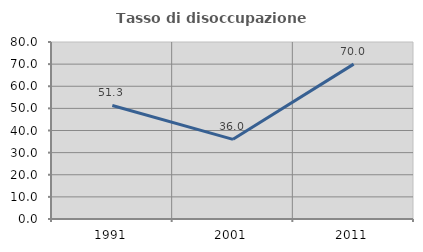
| Category | Tasso di disoccupazione giovanile  |
|---|---|
| 1991.0 | 51.316 |
| 2001.0 | 36 |
| 2011.0 | 70 |